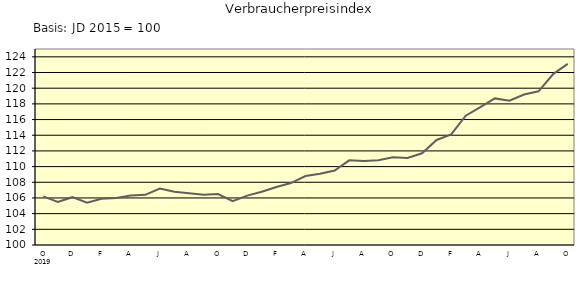
| Category | Series 0 |
|---|---|
| 0 | 106.2 |
| 1 | 105.5 |
| 2 | 106.1 |
| 3 | 105.4 |
| 4 | 105.9 |
| 5 | 106 |
| 6 | 106.3 |
| 7 | 106.4 |
| 8 | 107.2 |
| 9 | 106.8 |
| 10 | 106.6 |
| 11 | 106.4 |
| 12 | 106.5 |
| 13 | 105.6 |
| 14 | 106.3 |
| 15 | 106.8 |
| 16 | 107.4 |
| 17 | 107.9 |
| 18 | 108.8 |
| 19 | 109.1 |
| 20 | 109.5 |
| 21 | 110.8 |
| 22 | 110.7 |
| 23 | 110.8 |
| 24 | 111.2 |
| 25 | 111.1 |
| 26 | 111.7 |
| 27 | 113.4 |
| 28 | 114.1 |
| 29 | 116.5 |
| 30 | 117.6 |
| 31 | 118.7 |
| 32 | 118.4 |
| 33 | 119.2 |
| 34 | 119.6 |
| 35 | 121.8 |
| 36 | 123.1 |